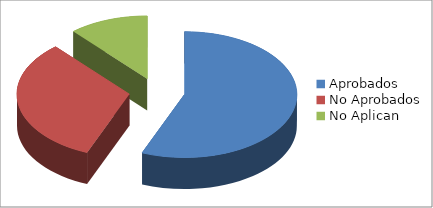
| Category | Series 0 |
|---|---|
| Aprobados | 64 |
| No Aprobados | 37 |
| No Aplican | 13 |